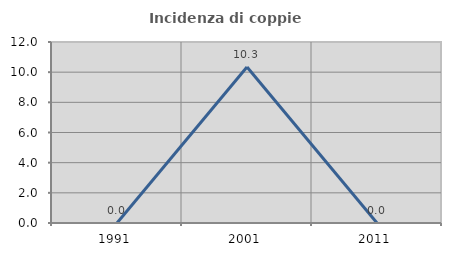
| Category | Incidenza di coppie miste |
|---|---|
| 1991.0 | 0 |
| 2001.0 | 10.345 |
| 2011.0 | 0 |